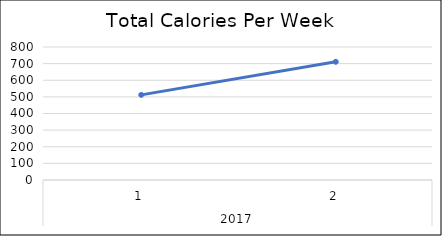
| Category | Total |
|---|---|
| 0 | 512 |
| 1 | 711 |